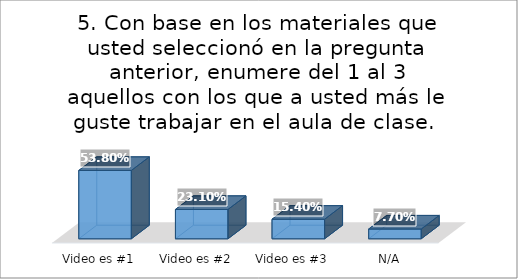
| Category | Series 0 |
|---|---|
| Video es #1 | 0.538 |
| Video es #2 | 0.231 |
| Video es #3 | 0.154 |
| N/A | 0.077 |